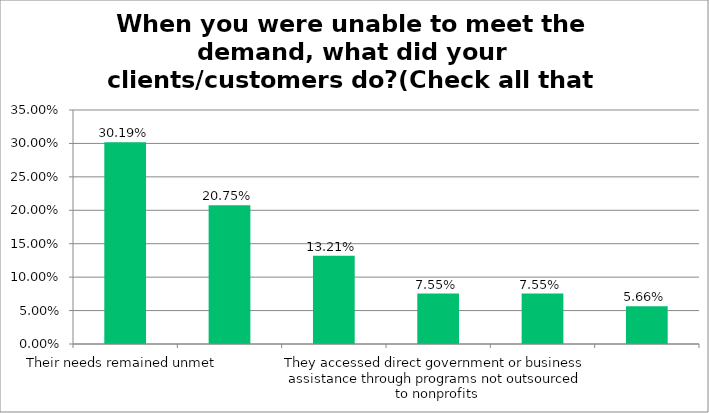
| Category | Responses |
|---|---|
| Their needs remained unmet | 0.302 |
| They sought similar programs and/or services from another organization | 0.208 |
| They sought assistance from personal networks (family, friends, etc.) | 0.132 |
| They accessed direct government or business assistance through programs not outsourced to nonprofits | 0.076 |
| Don't know | 0.076 |
| Other | 0.057 |